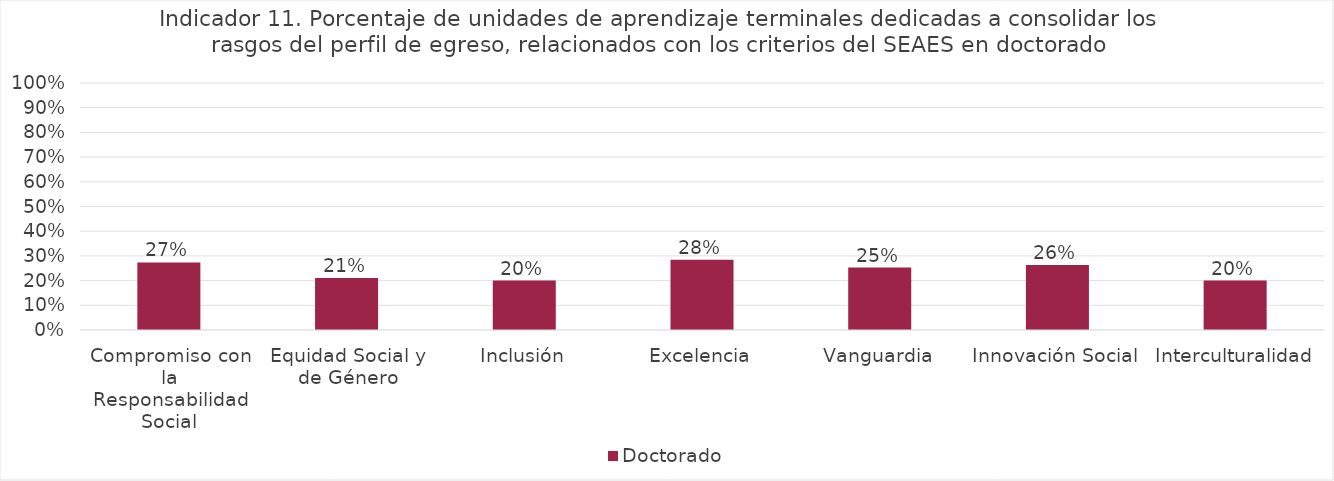
| Category | Doctorado |
|---|---|
| Compromiso con la Responsabilidad Social | 0.274 |
| Equidad Social y de Género | 0.211 |
| Inclusión | 0.2 |
| Excelencia | 0.284 |
| Vanguardia | 0.253 |
| Innovación Social | 0.263 |
| Interculturalidad | 0.2 |